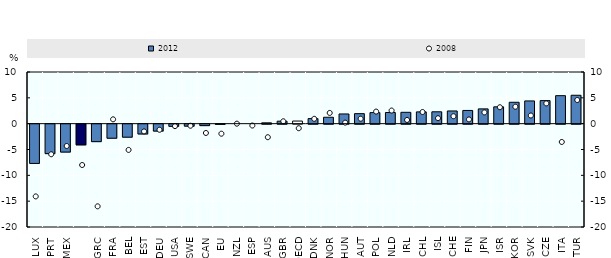
| Category | 2012 |
|---|---|
| LUX | -7.6 |
| PRT | -5.7 |
| MEX | -5.4 |
|  | -4 |
| GRC | -3.38 |
| FRA | -2.72 |
| BEL | -2.52 |
| EST | -1.9 |
| DEU | -1.34 |
| USA | -0.42 |
| SWE | -0.38 |
| CAN | -0.28 |
| EU | -0.044 |
| NZL | 0 |
| ESP | 0 |
| AUS | 0.16 |
| GBR | 0.48 |
| OECD | 0.505 |
| DNK | 0.98 |
| NOR | 1.24 |
| HUN | 1.88 |
| AUT | 1.94 |
| POL | 2.14 |
| NLD | 2.16 |
| IRL | 2.2 |
| CHL | 2.28 |
| ISL | 2.3 |
| CHE | 2.46 |
| FIN | 2.56 |
| JPN | 2.86 |
| ISR | 3.26 |
| KOR | 4.14 |
| SVK | 4.4 |
| CZE | 4.46 |
| ITA | 5.42 |
| TUR | 5.5 |